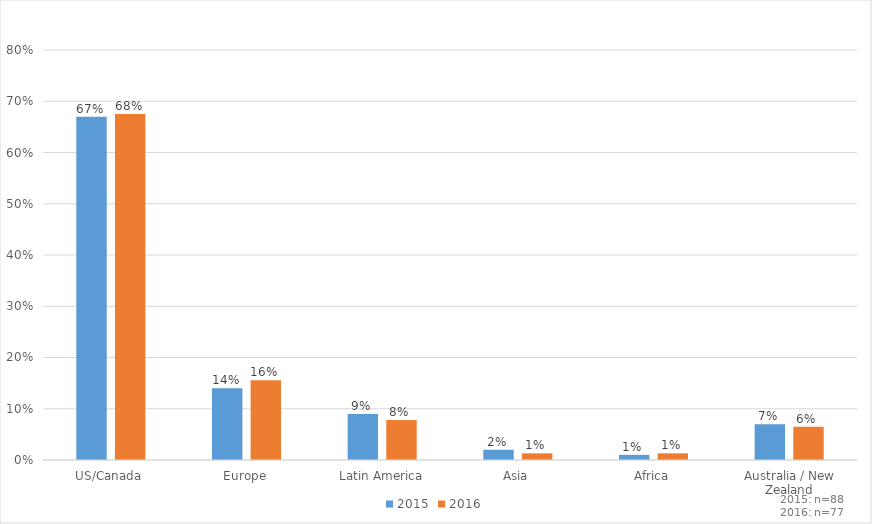
| Category | 2015 | 2016 |
|---|---|---|
| US/Canada | 0.67 | 0.675 |
| Europe | 0.14 | 0.156 |
| Latin America | 0.09 | 0.078 |
| Asia | 0.02 | 0.013 |
| Africa | 0.01 | 0.013 |
| Australia / New Zealand | 0.07 | 0.065 |